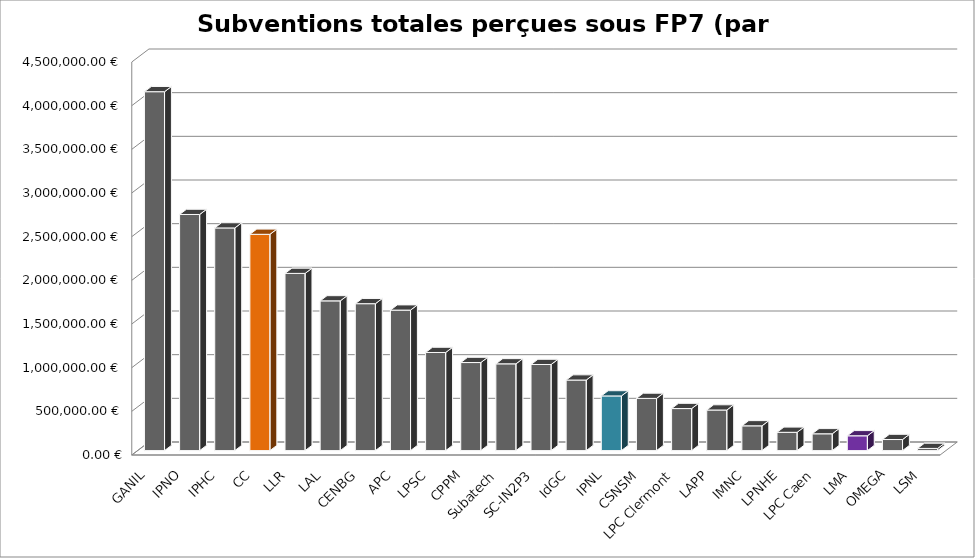
| Category | Series 0 |
|---|---|
| GANIL | 4109531.96 |
| IPNO | 2703714.88 |
| IPHC | 2549577.14 |
| CC | 2476609.4 |
| LLR | 2028971.6 |
| LAL | 1714375.3 |
| CENBG | 1682171.95 |
| APC | 1608735.66 |
| LPSC | 1123318.7 |
| CPPM | 1008350.49 |
| Subatech | 993530.03 |
| SC-IN2P3 | 986013.28 |
| IdGC | 807855.82 |
| IPNL | 626099.34 |
| CSNSM | 597798.26 |
| LPC Clermont | 481402.41 |
| LAPP | 464837.73 |
| IMNC | 283598.2 |
| LPNHE | 209405.43 |
| LPC Caen | 192500 |
| LMA | 169564.84 |
| OMEGA | 126858.18 |
| LSM | 25000 |